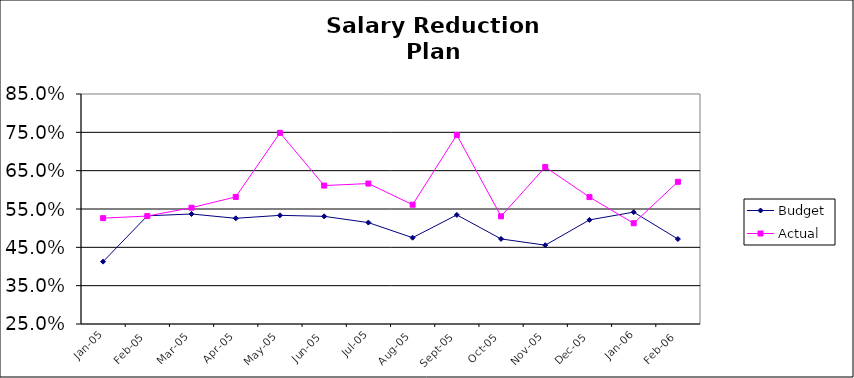
| Category | Budget | Actual |
|---|---|---|
| 2005-01-31 | 0.413 | 0.526 |
| 2005-02-28 | 0.532 | 0.532 |
| 2005-03-31 | 0.537 | 0.553 |
| 2005-04-30 | 0.526 | 0.582 |
| 2005-05-31 | 0.533 | 0.749 |
| 2005-06-30 | 0.531 | 0.611 |
| 2005-07-31 | 0.515 | 0.616 |
| 2005-08-31 | 0.475 | 0.561 |
| 2005-09-30 | 0.535 | 0.743 |
| 2005-10-31 | 0.472 | 0.531 |
| 2005-11-30 | 0.456 | 0.659 |
| 2005-12-30 | 0.522 | 0.581 |
| 2006-01-31 | 0.542 | 0.513 |
| 2006-02-28 | 0.472 | 0.621 |